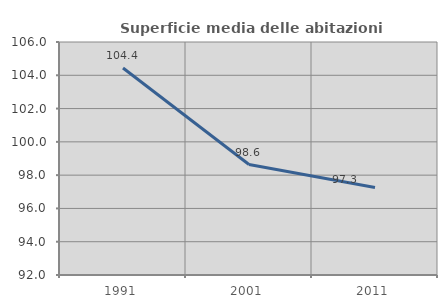
| Category | Superficie media delle abitazioni occupate |
|---|---|
| 1991.0 | 104.435 |
| 2001.0 | 98.638 |
| 2011.0 | 97.254 |